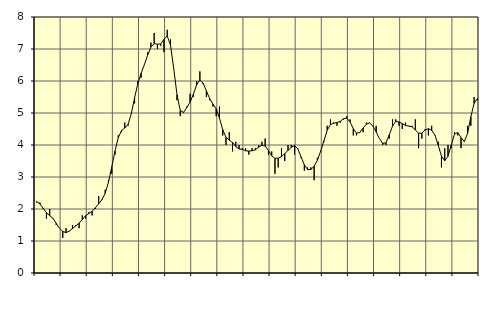
| Category | Piggar | Series 1 |
|---|---|---|
| nan | 2.2 | 2.23 |
| 87.0 | 2.2 | 2.16 |
| 87.0 | 2 | 2.02 |
| 87.0 | 1.7 | 1.89 |
| nan | 2 | 1.79 |
| 88.0 | 1.7 | 1.71 |
| 88.0 | 1.5 | 1.55 |
| 88.0 | 1.4 | 1.4 |
| nan | 1.1 | 1.3 |
| 89.0 | 1.4 | 1.26 |
| 89.0 | 1.3 | 1.31 |
| 89.0 | 1.5 | 1.39 |
| nan | 1.5 | 1.47 |
| 90.0 | 1.4 | 1.56 |
| 90.0 | 1.8 | 1.67 |
| 90.0 | 1.7 | 1.79 |
| nan | 1.9 | 1.86 |
| 91.0 | 1.8 | 1.93 |
| 91.0 | 2 | 2.04 |
| 91.0 | 2.4 | 2.16 |
| nan | 2.3 | 2.29 |
| 92.0 | 2.6 | 2.49 |
| 92.0 | 2.9 | 2.83 |
| 92.0 | 3.1 | 3.31 |
| nan | 3.7 | 3.81 |
| 93.0 | 4.3 | 4.23 |
| 93.0 | 4.4 | 4.45 |
| 93.0 | 4.7 | 4.53 |
| nan | 4.6 | 4.64 |
| 94.0 | 5 | 4.98 |
| 94.0 | 5.3 | 5.47 |
| 94.0 | 6 | 5.92 |
| nan | 6.1 | 6.24 |
| 95.0 | 6.5 | 6.51 |
| 95.0 | 6.9 | 6.81 |
| 95.0 | 7.2 | 7.06 |
| nan | 7.5 | 7.17 |
| 96.0 | 7 | 7.15 |
| 96.0 | 7.1 | 7.16 |
| 96.0 | 6.9 | 7.3 |
| nan | 7.6 | 7.41 |
| 97.0 | 7.3 | 7.12 |
| 97.0 | 6.4 | 6.39 |
| 97.0 | 5.4 | 5.57 |
| nan | 4.9 | 5.08 |
| 98.0 | 5 | 5.02 |
| 98.0 | 5.2 | 5.17 |
| 98.0 | 5.6 | 5.34 |
| nan | 5.5 | 5.58 |
| 99.0 | 6 | 5.88 |
| 99.0 | 6.3 | 6.03 |
| 99.0 | 5.9 | 5.93 |
| nan | 5.5 | 5.69 |
| 0.0 | 5.4 | 5.45 |
| 0.0 | 5.2 | 5.28 |
| 0.0 | 4.9 | 5.13 |
| nan | 5.2 | 4.84 |
| 1.0 | 4.3 | 4.48 |
| 1.0 | 4 | 4.24 |
| 1.0 | 4.4 | 4.15 |
| nan | 3.8 | 4.08 |
| 2.0 | 4.1 | 3.95 |
| 2.0 | 4 | 3.88 |
| 2.0 | 3.9 | 3.86 |
| nan | 3.9 | 3.82 |
| 3.0 | 3.7 | 3.81 |
| 3.0 | 3.9 | 3.82 |
| 3.0 | 3.9 | 3.85 |
| nan | 4 | 3.93 |
| 4.0 | 4.1 | 3.99 |
| 4.0 | 4.2 | 3.97 |
| 4.0 | 3.7 | 3.83 |
| nan | 3.8 | 3.66 |
| 5.0 | 3.1 | 3.58 |
| 5.0 | 3.3 | 3.59 |
| 5.0 | 3.9 | 3.64 |
| nan | 3.5 | 3.73 |
| 6.0 | 4 | 3.83 |
| 6.0 | 4 | 3.93 |
| 6.0 | 3.7 | 3.98 |
| nan | 3.9 | 3.88 |
| 7.0 | 3.6 | 3.63 |
| 7.0 | 3.2 | 3.38 |
| 7.0 | 3.3 | 3.23 |
| nan | 3.3 | 3.23 |
| 8.0 | 2.9 | 3.34 |
| 8.0 | 3.6 | 3.52 |
| 8.0 | 3.8 | 3.81 |
| nan | 4.1 | 4.13 |
| 9.0 | 4.6 | 4.46 |
| 9.0 | 4.8 | 4.64 |
| 9.0 | 4.7 | 4.68 |
| nan | 4.6 | 4.7 |
| 10.0 | 4.7 | 4.74 |
| 10.0 | 4.8 | 4.82 |
| 10.0 | 4.9 | 4.84 |
| nan | 4.8 | 4.72 |
| 11.0 | 4.3 | 4.51 |
| 11.0 | 4.3 | 4.37 |
| 11.0 | 4.4 | 4.39 |
| nan | 4.4 | 4.53 |
| 12.0 | 4.7 | 4.65 |
| 12.0 | 4.7 | 4.69 |
| 12.0 | 4.6 | 4.59 |
| nan | 4.6 | 4.41 |
| 13.0 | 4.2 | 4.2 |
| 13.0 | 4 | 4.05 |
| 13.0 | 4 | 4.07 |
| nan | 4.2 | 4.31 |
| 14.0 | 4.8 | 4.59 |
| 14.0 | 4.8 | 4.74 |
| 14.0 | 4.6 | 4.72 |
| nan | 4.5 | 4.67 |
| 15.0 | 4.7 | 4.61 |
| 15.0 | 4.6 | 4.59 |
| 15.0 | 4.6 | 4.57 |
| nan | 4.8 | 4.47 |
| 16.0 | 3.9 | 4.37 |
| 16.0 | 4.2 | 4.37 |
| 16.0 | 4.5 | 4.47 |
| nan | 4.3 | 4.51 |
| 17.0 | 4.6 | 4.46 |
| 17.0 | 4.3 | 4.31 |
| 17.0 | 4.1 | 4 |
| nan | 3.3 | 3.65 |
| 18.0 | 3.9 | 3.51 |
| 18.0 | 4 | 3.65 |
| 18.0 | 3.9 | 4 |
| nan | 4.4 | 4.34 |
| 19.0 | 4.3 | 4.39 |
| 19.0 | 3.9 | 4.23 |
| 19.0 | 4.1 | 4.11 |
| nan | 4.6 | 4.36 |
| 20.0 | 4.6 | 4.88 |
| 20.0 | 5.5 | 5.3 |
| 20.0 | 5.4 | 5.45 |